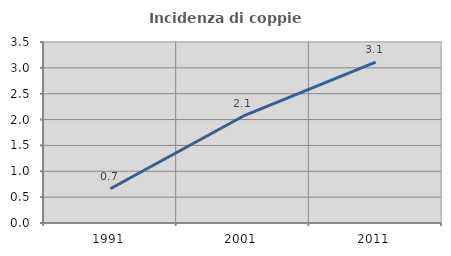
| Category | Incidenza di coppie miste |
|---|---|
| 1991.0 | 0.663 |
| 2001.0 | 2.065 |
| 2011.0 | 3.112 |